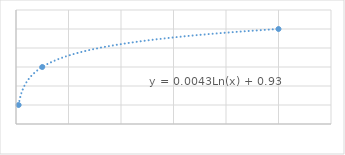
| Category | Series 0 |
|---|---|
| 1000.0 | 0.96 |
| 100.0 | 0.95 |
| 10.0 | 0.94 |